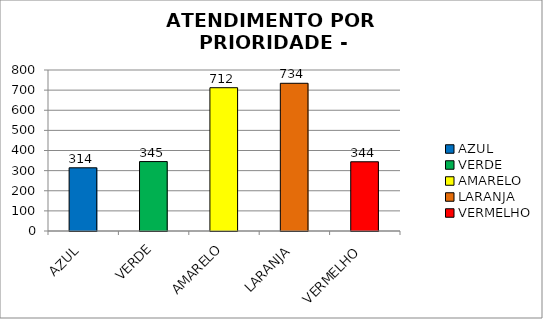
| Category | Total Regional: |
|---|---|
| AZUL | 314 |
| VERDE | 345 |
| AMARELO | 712 |
| LARANJA | 734 |
| VERMELHO | 344 |